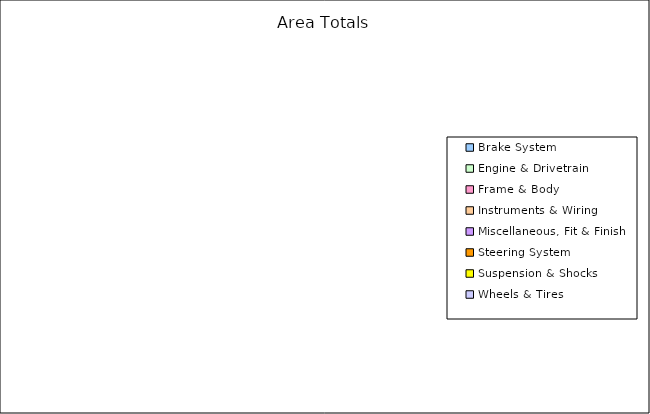
| Category | Area Totals |
|---|---|
| Brake System | 0 |
| Engine & Drivetrain | 0 |
| Frame & Body | 0 |
| Instruments & Wiring | 0 |
| Miscellaneous, Fit & Finish | 0 |
| Steering System | 0 |
| Suspension & Shocks | 0 |
| Wheels & Tires | 0 |